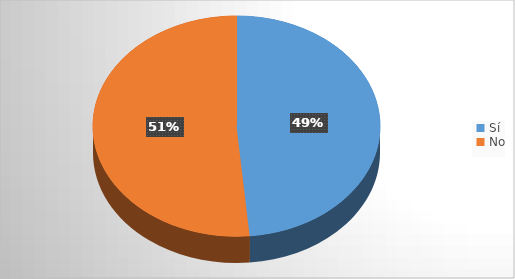
| Category | Series 0 |
|---|---|
| Sí | 50 |
| No | 53 |